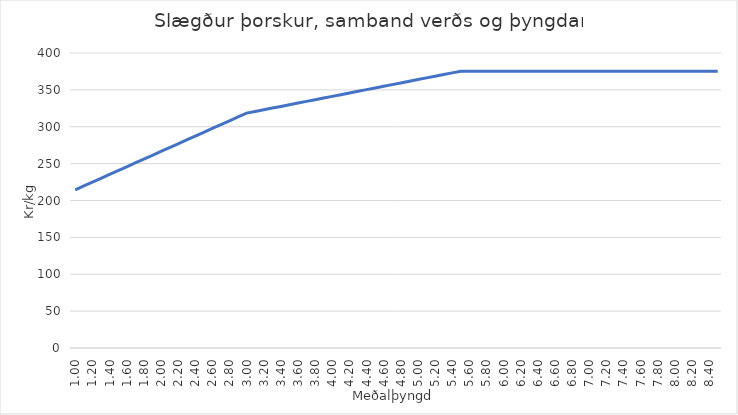
| Category | Series 0 |
|---|---|
| 1.0 | 214.483 |
| 1.1 | 219.682 |
| 1.2 | 224.882 |
| 1.3 | 230.082 |
| 1.4 | 235.281 |
| 1.5 | 240.481 |
| 1.6 | 245.68 |
| 1.7 | 250.88 |
| 1.8 | 256.079 |
| 1.9 | 261.279 |
| 2.0 | 266.479 |
| 2.1 | 271.678 |
| 2.2 | 276.878 |
| 2.3 | 282.077 |
| 2.4 | 287.277 |
| 2.5 | 292.477 |
| 2.6 | 297.676 |
| 2.7 | 302.876 |
| 2.8 | 308.075 |
| 2.9 | 313.275 |
| 3.0 | 318.474 |
| 3.1 | 320.749 |
| 3.2 | 323.024 |
| 3.3 | 325.299 |
| 3.4 | 327.574 |
| 3.5 | 329.849 |
| 3.6 | 332.124 |
| 3.7 | 334.399 |
| 3.8 | 336.674 |
| 3.9 | 338.949 |
| 4.0 | 341.223 |
| 4.1 | 343.498 |
| 4.2 | 345.773 |
| 4.3 | 348.048 |
| 4.4 | 350.323 |
| 4.5 | 352.598 |
| 4.6 | 354.873 |
| 4.7 | 357.148 |
| 4.8 | 359.423 |
| 4.9 | 361.698 |
| 5.0 | 363.972 |
| 5.1 | 366.247 |
| 5.2 | 368.522 |
| 5.3 | 370.797 |
| 5.4 | 373.072 |
| 5.5 | 375.347 |
| 5.6 | 375.347 |
| 5.7 | 375.347 |
| 5.8 | 375.347 |
| 5.9 | 375.347 |
| 6.0 | 375.347 |
| 6.1 | 375.347 |
| 6.2 | 375.347 |
| 6.3 | 375.347 |
| 6.4 | 375.347 |
| 6.50000000000001 | 375.347 |
| 6.6 | 375.347 |
| 6.7 | 375.347 |
| 6.80000000000001 | 375.347 |
| 6.90000000000001 | 375.347 |
| 7.00000000000001 | 375.347 |
| 7.100000000000009 | 375.347 |
| 7.200000000000009 | 375.347 |
| 7.300000000000009 | 375.347 |
| 7.400000000000008 | 375.347 |
| 7.500000000000008 | 375.347 |
| 7.600000000000008 | 375.347 |
| 7.700000000000007 | 375.347 |
| 7.800000000000007 | 375.347 |
| 7.900000000000007 | 375.347 |
| 8.000000000000007 | 375.347 |
| 8.100000000000007 | 375.347 |
| 8.200000000000006 | 375.347 |
| 8.300000000000006 | 375.347 |
| 8.400000000000006 | 375.347 |
| 8.500000000000005 | 375.347 |